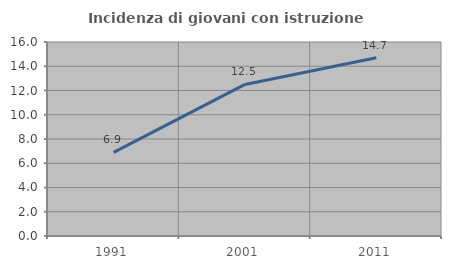
| Category | Incidenza di giovani con istruzione universitaria |
|---|---|
| 1991.0 | 6.897 |
| 2001.0 | 12.5 |
| 2011.0 | 14.706 |